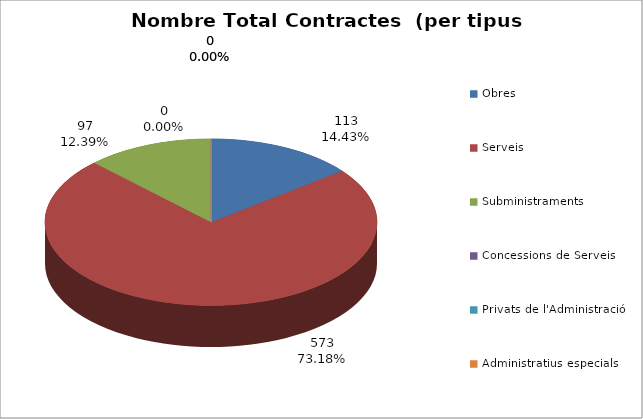
| Category | Nombre Total Contractes |
|---|---|
| Obres | 113 |
| Serveis | 573 |
| Subministraments | 97 |
| Concessions de Serveis | 0 |
| Privats de l'Administració | 0 |
| Administratius especials | 0 |